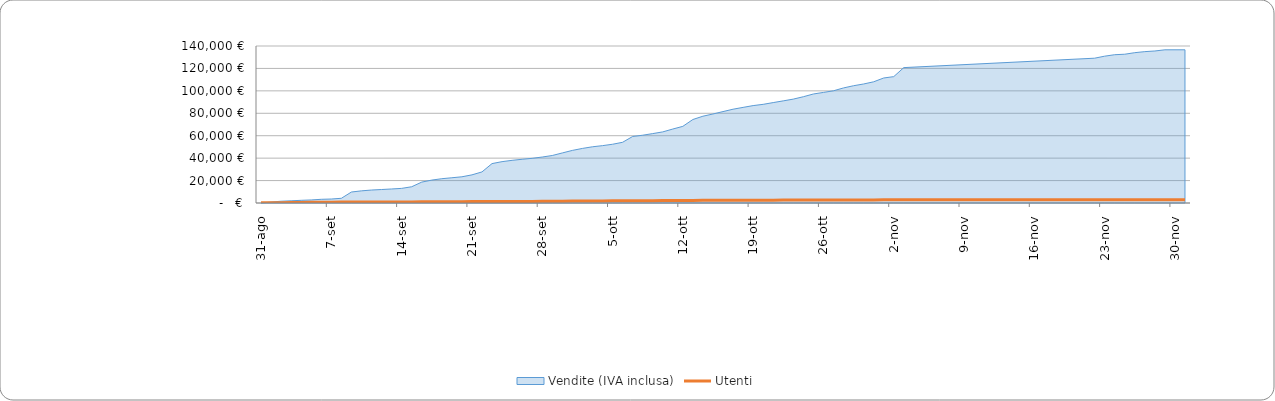
| Category | Utenti |
|---|---|
| 2021-08-31 | 179 |
| 2021-09-01 | 209 |
| 2021-09-02 | 249 |
| 2021-09-03 | 368 |
| 2021-09-04 | 488 |
| 2021-09-05 | 597 |
| 2021-09-06 | 671 |
| 2021-09-07 | 738 |
| 2021-09-08 | 788 |
| 2021-09-09 | 835 |
| 2021-09-10 | 862 |
| 2021-09-11 | 890 |
| 2021-09-12 | 902 |
| 2021-09-13 | 918 |
| 2021-09-14 | 962 |
| 2021-09-15 | 1000 |
| 2021-09-16 | 1027 |
| 2021-09-17 | 1053 |
| 2021-09-18 | 1098 |
| 2021-09-19 | 1145 |
| 2021-09-20 | 1190 |
| 2021-09-21 | 1254 |
| 2021-09-22 | 1298 |
| 2021-09-23 | 1344 |
| 2021-09-24 | 1370 |
| 2021-09-25 | 1388 |
| 2021-09-26 | 1412 |
| 2021-09-27 | 1433 |
| 2021-09-28 | 1475 |
| 2021-09-29 | 1520 |
| 2021-09-30 | 1650 |
| 2021-10-01 | 1735 |
| 2021-10-02 | 1779 |
| 2021-10-03 | 1821 |
| 2021-10-04 | 1861 |
| 2021-10-05 | 1905 |
| 2021-10-06 | 1942 |
| 2021-10-07 | 1984 |
| 2021-10-08 | 2047 |
| 2021-10-09 | 2108 |
| 2021-10-10 | 2160 |
| 2021-10-11 | 2209 |
| 2021-10-12 | 2269 |
| 2021-10-13 | 2320 |
| 2021-10-14 | 2355 |
| 2021-10-15 | 2381 |
| 2021-10-16 | 2413 |
| 2021-10-17 | 2435 |
| 2021-10-18 | 2464 |
| 2021-10-19 | 2492 |
| 2021-10-20 | 2515 |
| 2021-10-21 | 2554 |
| 2021-10-22 | 2579 |
| 2021-10-23 | 2601 |
| 2021-10-24 | 2625 |
| 2021-10-25 | 2652 |
| 2021-10-26 | 2670 |
| 2021-10-27 | 2682 |
| 2021-10-28 | 2703 |
| 2021-10-29 | 2720 |
| 2021-10-30 | 2737 |
| 2021-10-31 | 2784 |
| 2021-11-01 | 2828 |
| 2021-11-02 | 2858 |
| 2021-11-03 | 2877 |
| 2021-11-22 | 2883 |
| 2021-11-23 | 2884 |
| 2021-11-24 | 2889 |
| 2021-11-25 | 2893 |
| 2021-11-26 | 2895 |
| 2021-11-27 | 2901 |
| 2021-11-28 | 2903 |
| 2021-11-29 | 2903 |
| 2021-12-01 | 2903 |